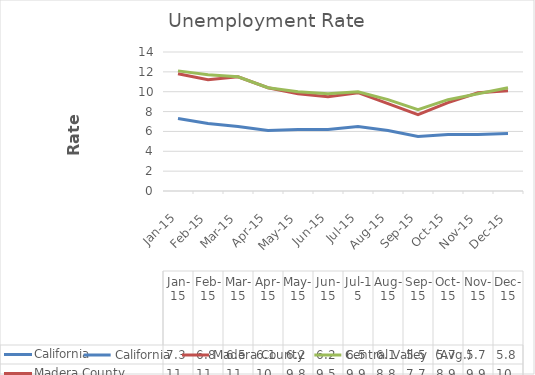
| Category | California | Madera County | Central Valley  (Avg.) |
|---|---|---|---|
| 2015-01-01 | 7.3 | 11.8 | 12.1 |
| 2015-02-01 | 6.8 | 11.2 | 11.7 |
| 2015-03-01 | 6.5 | 11.5 | 11.5 |
| 2015-04-01 | 6.1 | 10.4 | 10.4 |
| 2015-05-01 | 6.2 | 9.8 | 10 |
| 2015-06-01 | 6.2 | 9.5 | 9.8 |
| 2015-07-01 | 6.5 | 9.9 | 10 |
| 2015-08-01 | 6.1 | 8.8 | 9.2 |
| 2015-09-01 | 5.5 | 7.7 | 8.2 |
| 2015-10-01 | 5.7 | 8.9 | 9.2 |
| 2015-11-01 | 5.7 | 9.9 | 9.8 |
| 2015-12-01 | 5.8 | 10.1 | 10.4 |